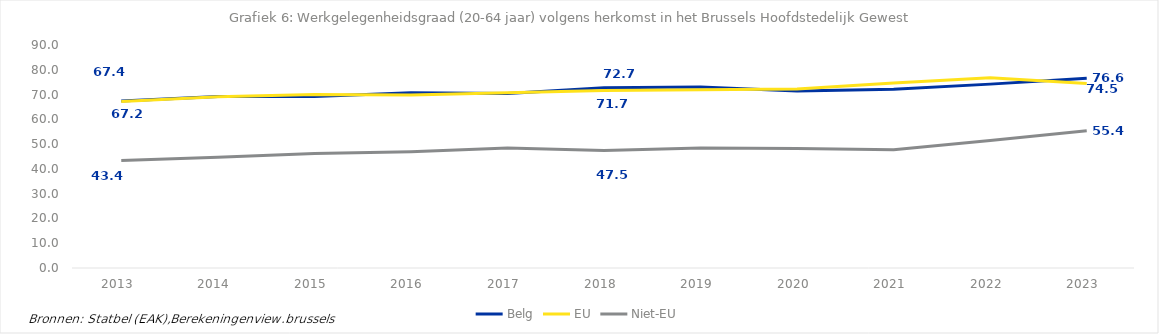
| Category | Belg | EU | Niet-EU |
|---|---|---|---|
| 2013.0 | 67.351 | 67.227 | 43.365 |
| 2014.0 | 69.247 | 69.12 | 44.724 |
| 2015.0 | 69.209 | 70.011 | 46.169 |
| 2016.0 | 70.706 | 69.838 | 46.943 |
| 2017.0 | 70.472 | 70.776 | 48.384 |
| 2018.0 | 72.708 | 71.687 | 47.469 |
| 2019.0 | 73.097 | 71.927 | 48.447 |
| 2020.0 | 71.393 | 72.25 | 48.265 |
| 2021.0 | 72.108 | 74.693 | 47.734 |
| 2022.0 | 74.209 | 76.753 | 51.495 |
| 2023.0 | 76.58 | 74.489 | 55.374 |